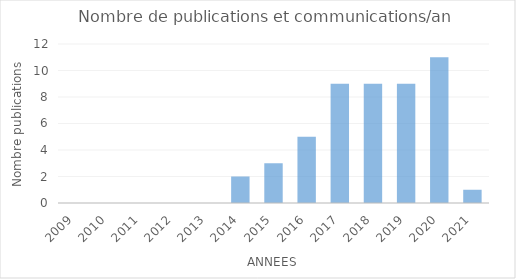
| Category | Series 0 |
|---|---|
| 2009.0 | 0 |
| 2010.0 | 0 |
| 2011.0 | 0 |
| 2012.0 | 0 |
| 2013.0 | 0 |
| 2014.0 | 2 |
| 2015.0 | 3 |
| 2016.0 | 5 |
| 2017.0 | 9 |
| 2018.0 | 9 |
| 2019.0 | 9 |
| 2020.0 | 11 |
| 2021.0 | 1 |